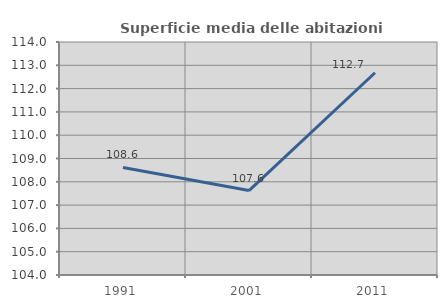
| Category | Superficie media delle abitazioni occupate |
|---|---|
| 1991.0 | 108.615 |
| 2001.0 | 107.623 |
| 2011.0 | 112.68 |